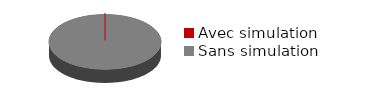
| Category | Colonne1 |
|---|---|
| Avec simulation | 0 |
| Sans simulation | 100 |